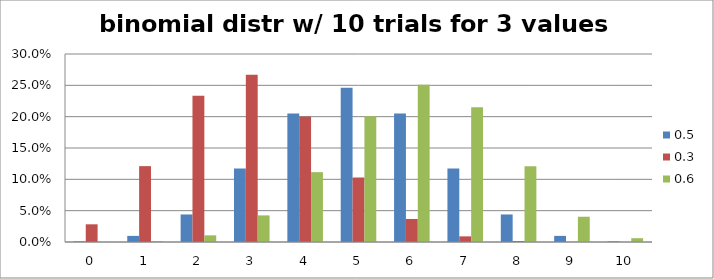
| Category | 0.5 | 0.3 | 0.6 |
|---|---|---|---|
| 0.0 | 0.001 | 0.028 | 0 |
| 1.0 | 0.01 | 0.121 | 0.002 |
| 2.0 | 0.044 | 0.233 | 0.011 |
| 3.0 | 0.117 | 0.267 | 0.042 |
| 4.0 | 0.205 | 0.2 | 0.111 |
| 5.0 | 0.246 | 0.103 | 0.201 |
| 6.0 | 0.205 | 0.037 | 0.251 |
| 7.0 | 0.117 | 0.009 | 0.215 |
| 8.0 | 0.044 | 0.001 | 0.121 |
| 9.0 | 0.01 | 0 | 0.04 |
| 10.0 | 0.001 | 0 | 0.006 |